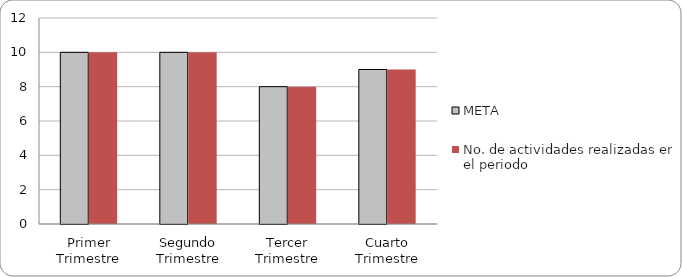
| Category | META | No. de actividades realizadas en el periodo |
|---|---|---|
| Primer Trimestre | 10 | 10 |
| Segundo Trimestre | 10 | 10 |
| Tercer Trimestre | 8 | 8 |
| Cuarto Trimestre | 9 | 9 |